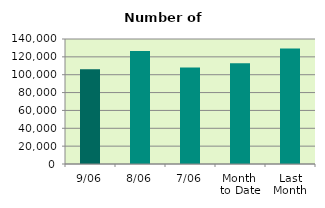
| Category | Series 0 |
|---|---|
| 9/06 | 106034 |
| 8/06 | 126700 |
| 7/06 | 108122 |
| Month 
to Date | 112825.143 |
| Last
Month | 129378.19 |